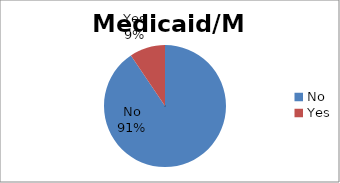
| Category | Series 0 |
|---|---|
| No | 90.559 |
| Yes | 9.441 |